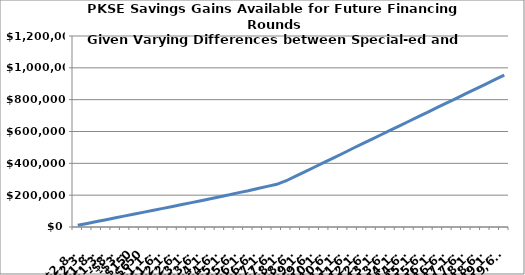
| Category | Present value of PKSE savings gains available to school district |
|---|---|
| -2850.0 | 10590.882 |
| -2350.0 | 22321.163 |
| -1850.0 | 34074.557 |
| -1350.0 | 46097.108 |
| -850.0 | 57871.206 |
| -350.0 | 69969.197 |
| 150.0 | 81764.888 |
| 650.0 | 93560.579 |
| 1150.0 | 105356.27 |
| 1650.0 | 117151.961 |
| 2150.0 | 129369.159 |
| 2650.0 | 141185.925 |
| 3150.0 | 153002.692 |
| 3650.0 | 164873.16 |
| 4150.0 | 176939.206 |
| 4650.0 | 190206.402 |
| 5150.0 | 202320.494 |
| 5650.0 | 215918.968 |
| 6150.0 | 228088.037 |
| 6650.0 | 242237.092 |
| 7150.0 | 255442.283 |
| 7650.0 | 268393.731 |
| 8150.0 | 290705.605 |
| 8650.0 | 319485.77 |
| 9150.0 | 348265.936 |
| 9650.0 | 377046.102 |
| 10150.0 | 405826.268 |
| 10650.0 | 434606.434 |
| 11150.0 | 463386.6 |
| 11650.0 | 493266.329 |
| 12150.0 | 522074.689 |
| 12650.0 | 550883.049 |
| 13150.0 | 579691.409 |
| 13650.0 | 608499.769 |
| 14150.0 | 637308.128 |
| 14650.0 | 666116.488 |
| 15150.0 | 694924.848 |
| 15650.0 | 723733.208 |
| 16150.0 | 752541.568 |
| 16650.0 | 781349.928 |
| 17150.0 | 810158.287 |
| 17650.0 | 838966.647 |
| 18150.0 | 867775.007 |
| 18650.0 | 896583.367 |
| 19150.0 | 925391.727 |
| 19650.0 | 954200.086 |